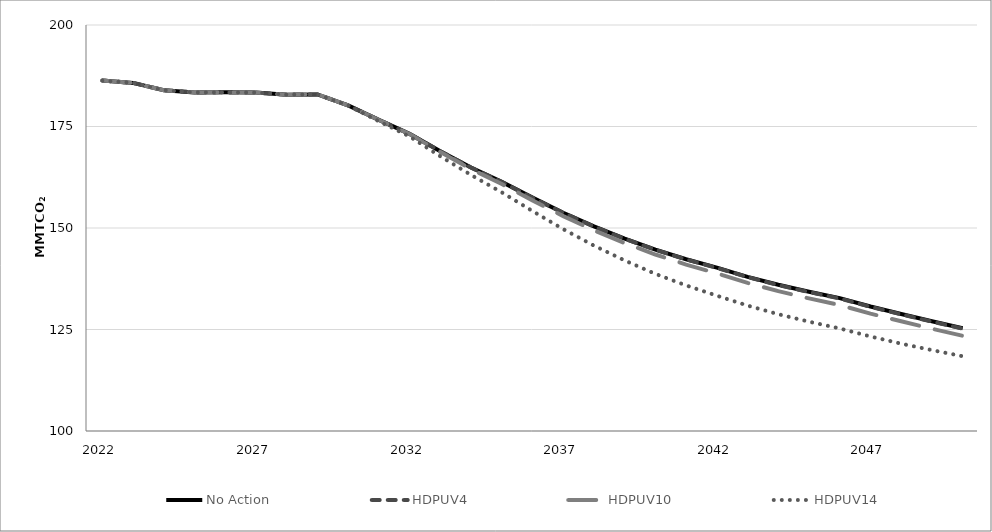
| Category | No Action | HDPUV4 | HDPUV10 | HDPUV14 |
|---|---|---|---|---|
| 2022.0 | 186.311 | 186.311 | 186.311 | 186.311 |
| 2023.0 | 185.738 | 185.738 | 185.738 | 185.738 |
| 2024.0 | 183.938 | 183.938 | 183.938 | 183.938 |
| 2025.0 | 183.389 | 183.389 | 183.389 | 183.389 |
| 2026.0 | 183.412 | 183.412 | 183.412 | 183.412 |
| 2027.0 | 183.345 | 183.345 | 183.345 | 183.345 |
| 2028.0 | 182.85 | 182.85 | 182.85 | 182.85 |
| 2029.0 | 182.907 | 182.907 | 182.907 | 182.907 |
| 2030.0 | 180.18 | 180.177 | 180.171 | 180.161 |
| 2031.0 | 176.631 | 176.627 | 176.609 | 176.285 |
| 2032.0 | 173.176 | 173.169 | 173.14 | 172.541 |
| 2033.0 | 168.914 | 168.903 | 168.707 | 167.66 |
| 2034.0 | 164.89 | 164.873 | 164.522 | 163.064 |
| 2035.0 | 161.361 | 161.34 | 160.841 | 158.778 |
| 2036.0 | 157.484 | 157.46 | 156.802 | 154.171 |
| 2037.0 | 153.761 | 153.733 | 152.926 | 149.715 |
| 2038.0 | 150.391 | 150.36 | 149.413 | 145.659 |
| 2039.0 | 147.38 | 147.348 | 146.283 | 142.005 |
| 2040.0 | 144.669 | 144.633 | 143.469 | 138.696 |
| 2041.0 | 142.303 | 142.259 | 140.997 | 135.855 |
| 2042.0 | 140.232 | 140.182 | 138.83 | 133.332 |
| 2043.0 | 137.974 | 137.915 | 136.486 | 130.897 |
| 2044.0 | 136.01 | 135.943 | 134.443 | 128.765 |
| 2045.0 | 134.292 | 134.219 | 132.653 | 126.923 |
| 2046.0 | 132.727 | 132.647 | 131.025 | 125.259 |
| 2047.0 | 130.669 | 130.588 | 128.919 | 123.287 |
| 2048.0 | 128.821 | 128.74 | 127.026 | 121.511 |
| 2049.0 | 127.02 | 126.941 | 125.192 | 119.926 |
| 2050.0 | 125.297 | 125.221 | 123.443 | 118.417 |